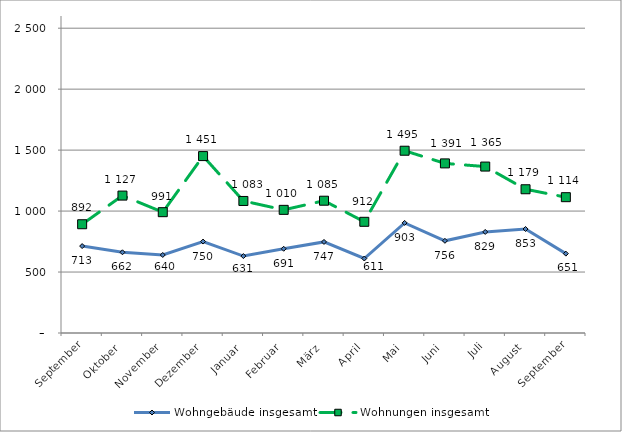
| Category | Wohngebäude insgesamt | Wohnungen insgesamt |
|---|---|---|
| September | 713 | 892 |
| Oktober | 662 | 1127 |
| November | 640 | 991 |
| Dezember | 750 | 1451 |
| Januar | 631 | 1083 |
| Februar | 691 | 1010 |
| März | 747 | 1085 |
| April | 611 | 912 |
| Mai | 903 | 1495 |
| Juni | 756 | 1391 |
| Juli | 829 | 1365 |
| August | 853 | 1179 |
| September | 651 | 1114 |